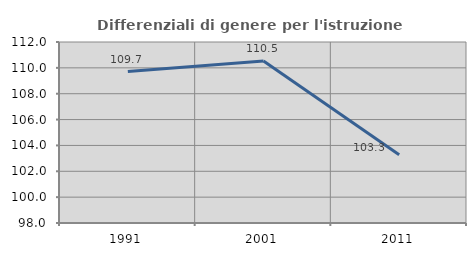
| Category | Differenziali di genere per l'istruzione superiore |
|---|---|
| 1991.0 | 109.709 |
| 2001.0 | 110.526 |
| 2011.0 | 103.28 |